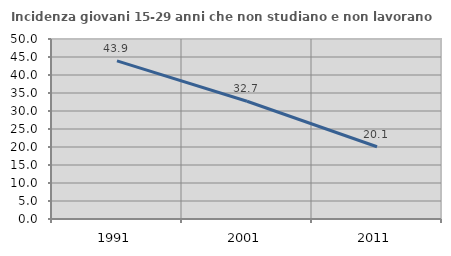
| Category | Incidenza giovani 15-29 anni che non studiano e non lavorano  |
|---|---|
| 1991.0 | 43.93 |
| 2001.0 | 32.701 |
| 2011.0 | 20.074 |